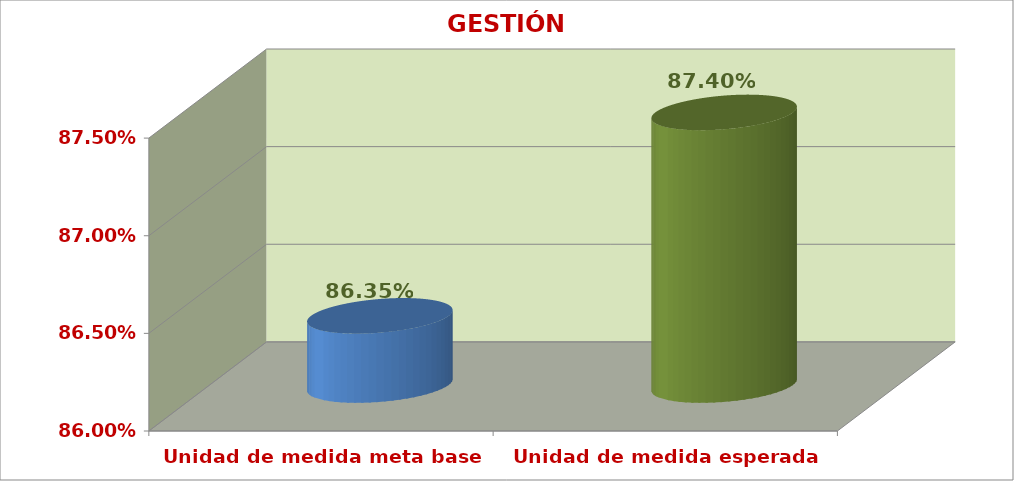
| Category | GESTIÓN ACADÉMICA |
|---|---|
| Unidad de medida meta base | 0.864 |
| Unidad de medida esperada | 0.874 |